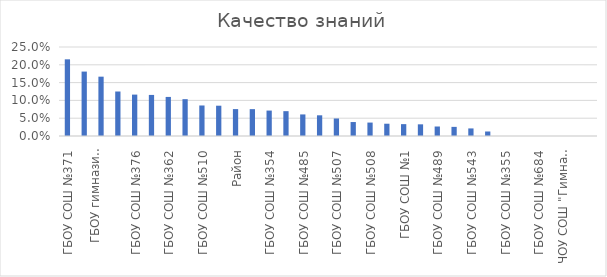
| Category | Series 0 |
|---|---|
| ГБОУ СОШ №371 | 0.215 |
| ГБОУ гимназия №524 | 0.181 |
| ГБОУ гимназия №526 | 0.167 |
| ГБОУ СОШ №496 | 0.125 |
| ГБОУ СОШ №376 | 0.116 |
| ГБОУ СОШ №537 | 0.115 |
| ГБОУ СОШ №362 | 0.11 |
| ГБОУ СОШ №536 | 0.103 |
| ГБОУ СОШ №510 | 0.086 |
| ГБОУ СОШ №495 | 0.085 |
| Район | 0.076 |
| ГБОУ СОШ №544 | 0.075 |
| ГБОУ СОШ №354 | 0.071 |
| ГБОУ СОШ №525 | 0.07 |
| ГБОУ СОШ №485 | 0.061 |
| ГБОУ СОШ №356 | 0.058 |
| ГБОУ СОШ №507 | 0.049 |
| ГБОУ СОШ №484 | 0.039 |
| ГБОУ СОШ №508 | 0.038 |
| ГБОУ СОШ №351 | 0.034 |
| ГБОУ СОШ №1 | 0.033 |
| ГБОУ СОШ №643 | 0.033 |
| ГБОУ СОШ №489 | 0.027 |
| ГБОУ ЦО №2 | 0.026 |
| ГБОУ СОШ №543 | 0.021 |
| ГБОУ СОШ №519 | 0.013 |
| ГБОУ СОШ №355 | 0 |
| ГБОУ СОШ №594 | 0 |
| ГБОУ СОШ №684 | 0 |
| Школа «Студиум» | 0 |
| ЧОУ СОШ "Гимназия"Северная Венеция | 0 |
| ЧОУ СВШ | 0 |